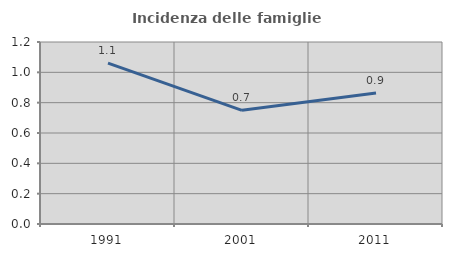
| Category | Incidenza delle famiglie numerose |
|---|---|
| 1991.0 | 1.061 |
| 2001.0 | 0.75 |
| 2011.0 | 0.864 |